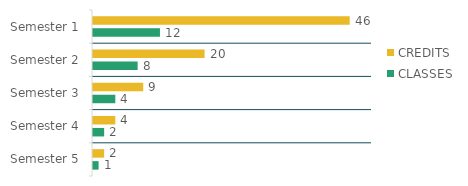
| Category | CREDITS   | CLASSES  |
|---|---|---|
| Semester 1 | 46 | 12 |
| Semester 2 | 20 | 8 |
| Semester 3 | 9 | 4 |
| Semester 4 | 4 | 2 |
| Semester 5 | 2 | 1 |